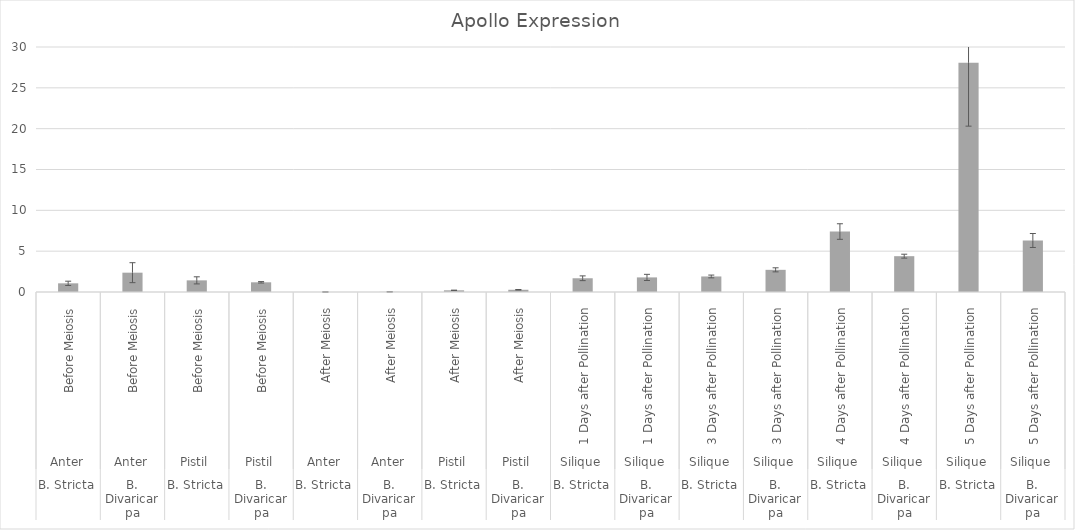
| Category | Series 0 |
|---|---|
| 0 | 1.062 |
| 1 | 2.366 |
| 2 | 1.425 |
| 3 | 1.188 |
| 4 | 0.004 |
| 5 | 0.017 |
| 6 | 0.207 |
| 7 | 0.273 |
| 8 | 1.683 |
| 9 | 1.787 |
| 10 | 1.903 |
| 11 | 2.714 |
| 12 | 7.403 |
| 13 | 4.387 |
| 14 | 28.065 |
| 15 | 6.308 |